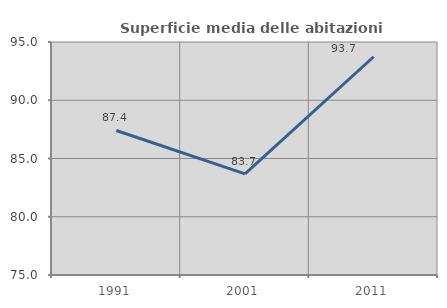
| Category | Superficie media delle abitazioni occupate |
|---|---|
| 1991.0 | 87.407 |
| 2001.0 | 83.686 |
| 2011.0 | 93.733 |